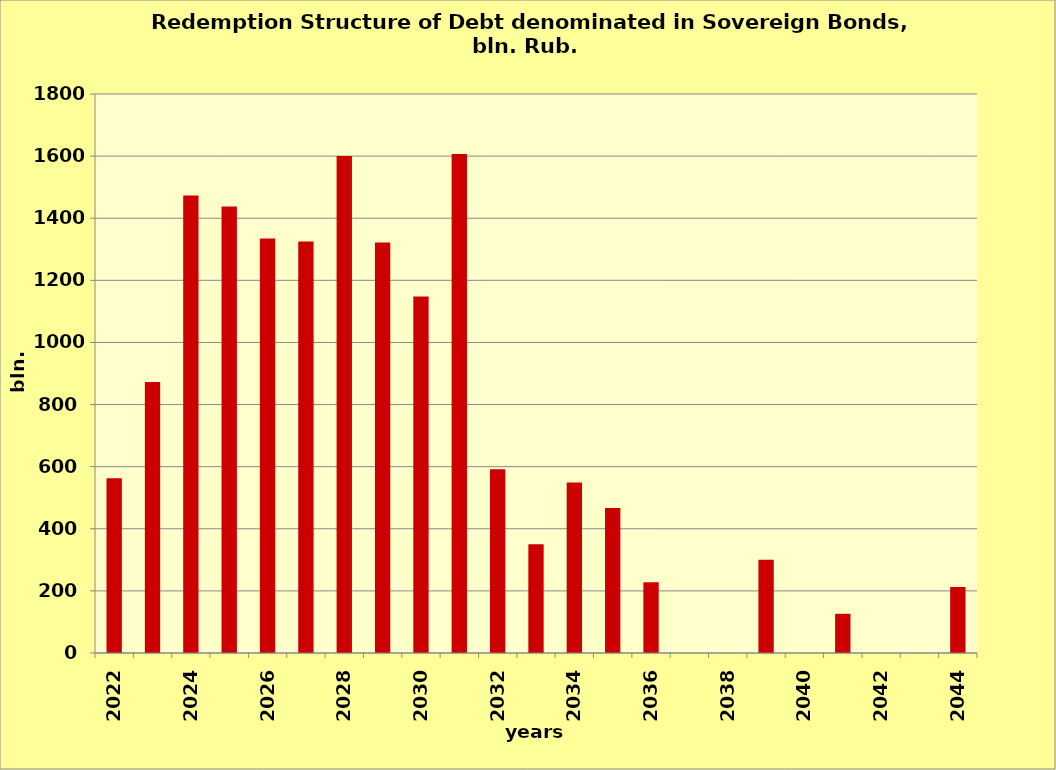
| Category | Series 0 |
|---|---|
| 2022.0 | 562.415 |
| 2023.0 | 872.777 |
| 2024.0 | 1472.945 |
| 2025.0 | 1437.745 |
| 2026.0 | 1334.561 |
| 2027.0 | 1324.833 |
| 2028.0 | 1600.628 |
| 2029.0 | 1321.585 |
| 2030.0 | 1147.914 |
| 2031.0 | 1606.903 |
| 2032.0 | 592.032 |
| 2033.0 | 350 |
| 2034.0 | 548.84 |
| 2035.0 | 467.105 |
| 2036.0 | 227.812 |
| 2037.0 | 0 |
| 2038.0 | 0 |
| 2039.0 | 300 |
| 2040.0 | 0 |
| 2041.0 | 126.269 |
| 2042.0 | 0 |
| 2043.0 | 0 |
| 2044.0 | 212.636 |